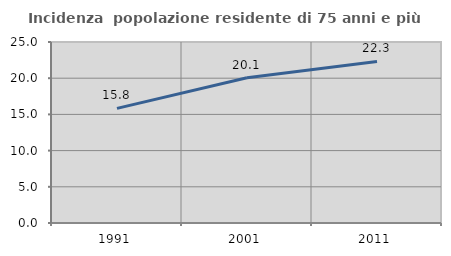
| Category | Incidenza  popolazione residente di 75 anni e più |
|---|---|
| 1991.0 | 15.831 |
| 2001.0 | 20.065 |
| 2011.0 | 22.318 |